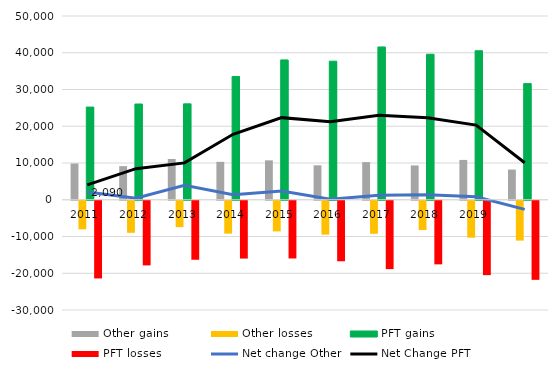
| Category | Other gains | Other losses | PFT gains | PFT losses |
|---|---|---|---|---|
| 2011.0 | 9861 | -7771 | 25211 | -21145 |
| 2012.0 | 9144 | -8725 | 26048 | -17585 |
| 2013.0 | 11090 | -7180 | 26092 | -16060 |
| 2014.0 | 10315 | -8949 | 33545 | -15731 |
| 2015.0 | 10720 | -8342 | 38049 | -15707 |
| 2016.0 | 9374 | -9218 | 37703 | -16466 |
| 2017.0 | 10242 | -8993 | 41575 | -18606 |
| 2018.0 | 9339 | -7959 | 39596 | -17309 |
| 2019.0 | 10836 | -10047 | 40552 | -20241 |